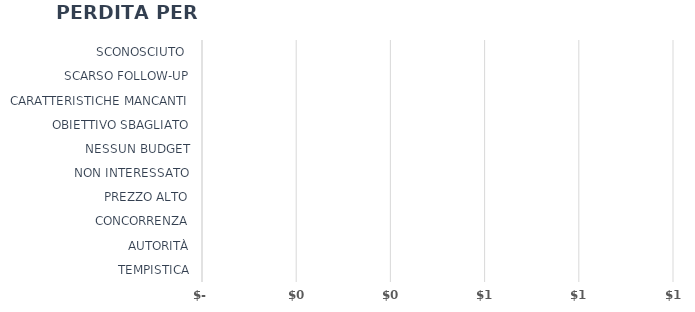
| Category | Series 1 |
|---|---|
| TEMPISTICA | 0 |
| AUTORITÀ | 0 |
| CONCORRENZA | 0 |
| PREZZO ALTO | 0 |
| NON INTERESSATO | 0 |
| NESSUN BUDGET | 0 |
| OBIETTIVO SBAGLIATO | 0 |
| CARATTERISTICHE MANCANTI | 0 |
| SCARSO FOLLOW-UP | 0 |
| SCONOSCIUTO  | 0 |